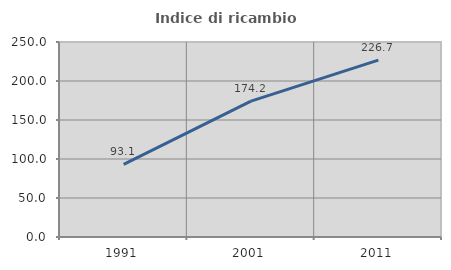
| Category | Indice di ricambio occupazionale  |
|---|---|
| 1991.0 | 93.077 |
| 2001.0 | 174.227 |
| 2011.0 | 226.733 |